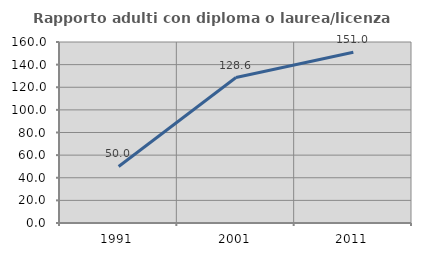
| Category | Rapporto adulti con diploma o laurea/licenza media  |
|---|---|
| 1991.0 | 50 |
| 2001.0 | 128.571 |
| 2011.0 | 150.98 |